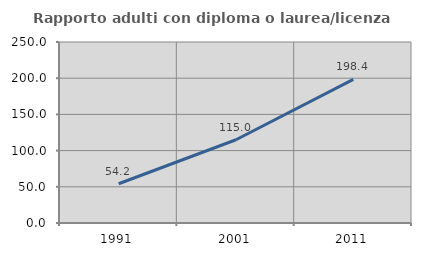
| Category | Rapporto adulti con diploma o laurea/licenza media  |
|---|---|
| 1991.0 | 54.194 |
| 2001.0 | 114.973 |
| 2011.0 | 198.37 |